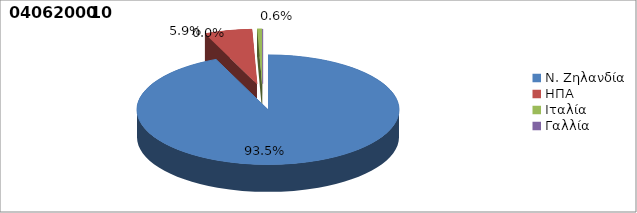
| Category | Series 0 |
|---|---|
| Ν. Ζηλανδία | 0.935 |
| ΗΠΑ | 0.059 |
| Ιταλία | 0.006 |
| Γαλλία | 0 |